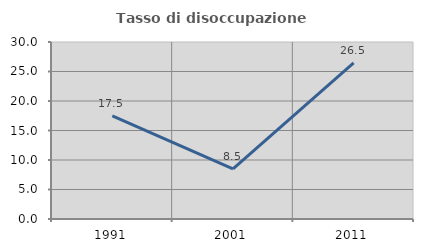
| Category | Tasso di disoccupazione giovanile  |
|---|---|
| 1991.0 | 17.46 |
| 2001.0 | 8.511 |
| 2011.0 | 26.471 |